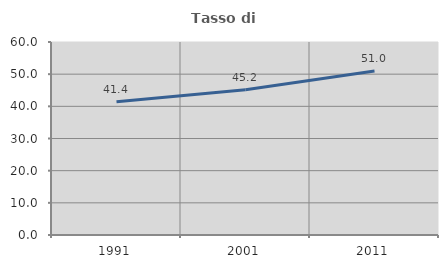
| Category | Tasso di occupazione   |
|---|---|
| 1991.0 | 41.39 |
| 2001.0 | 45.16 |
| 2011.0 | 50.967 |